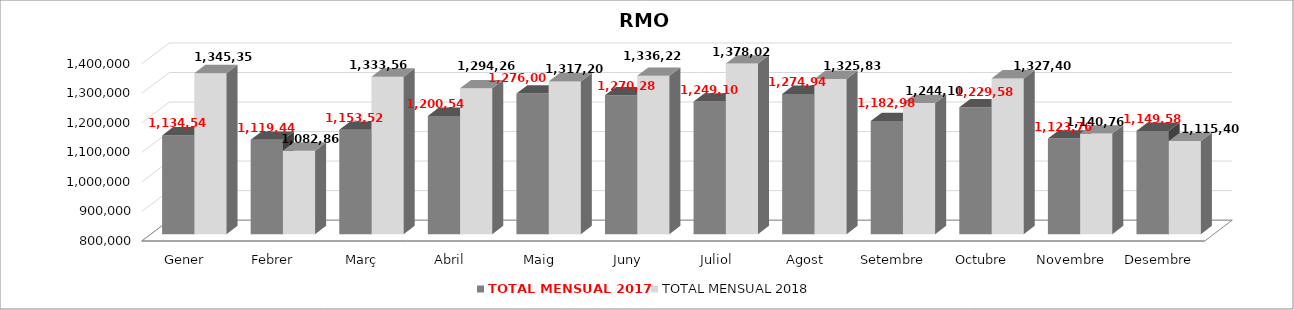
| Category | TOTAL MENSUAL 2017 | TOTAL MENSUAL 2018 |
|---|---|---|
| Gener | 1134540 | 1345359 |
| Febrer | 1119440 | 1082860 |
| Març | 1153520 | 1333560 |
| Abril | 1200540 | 1294260 |
| Maig | 1276000 | 1317200 |
| Juny | 1270280 | 1336220 |
| Juliol | 1249100 | 1378020 |
| Agost | 1274940 | 1325839 |
| Setembre | 1182980 | 1244100 |
| Octubre | 1229580 | 1327400 |
| Novembre | 1123760 | 1140760 |
| Desembre | 1149580 | 1115400 |